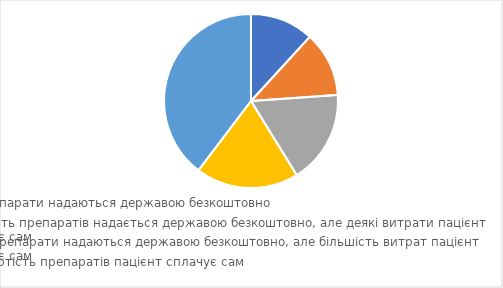
| Category | Series 0 |
|---|---|
| Всі препарати надаються державою безкоштовно | 0.118 |
| Більшість препаратів надається державою безкоштовно, але деякі витрати пацієнт сплачує сам | 0.121 |
| Деякі препарати надаються державою безкоштовно, але більшість витрат пацієнт сплачує сам | 0.173 |
| Всю вартість препаратів пацієнт сплачує сам | 0.191 |
| НЕ ЗНАЮ | 0.397 |